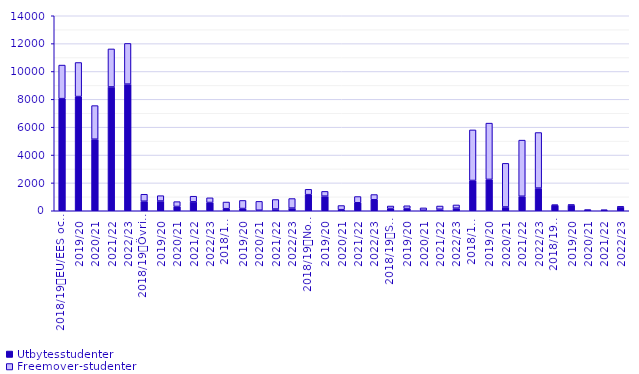
| Category | Utbytesstudenter | Freemover-studenter |
|---|---|---|
| 0 | 8050 | 2409 |
| 1 | 8199 | 2445 |
| 2 | 5137 | 2413 |
| 3 | 8890 | 2729 |
| 4 | 9092 | 2922 |
| 5 | 685 | 500 |
| 6 | 700 | 383 |
| 7 | 307 | 348 |
| 8 | 641 | 403 |
| 9 | 593 | 336 |
| 10 | 148 | 479 |
| 11 | 160 | 581 |
| 12 | 39 | 635 |
| 13 | 122 | 684 |
| 14 | 191 | 686 |
| 15 | 1156 | 383 |
| 16 | 1048 | 342 |
| 17 | 78 | 297 |
| 18 | 575 | 446 |
| 19 | 788 | 376 |
| 20 | 163 | 177 |
| 21 | 156 | 202 |
| 22 | 37 | 169 |
| 23 | 107 | 233 |
| 24 | 184 | 233 |
| 25 | 2174 | 3631 |
| 26 | 2251 | 4041 |
| 27 | 271 | 3133 |
| 28 | 1042 | 4029 |
| 29 | 1627 | 3989 |
| 30 | 394 | 29 |
| 31 | 406 | 24 |
| 32 | 43 | 15 |
| 33 | 33 | 22 |
| 34 | 274 | 20 |